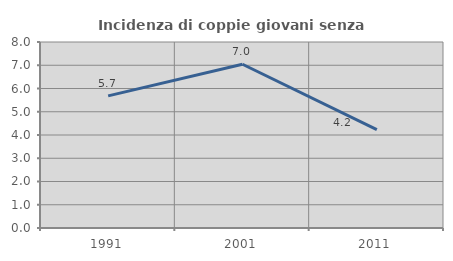
| Category | Incidenza di coppie giovani senza figli |
|---|---|
| 1991.0 | 5.684 |
| 2001.0 | 7.044 |
| 2011.0 | 4.23 |